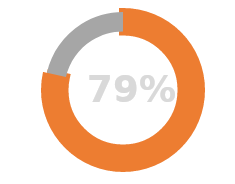
| Category | Series 0 |
|---|---|
| 0 | -0.785 |
| 1 | 0.215 |